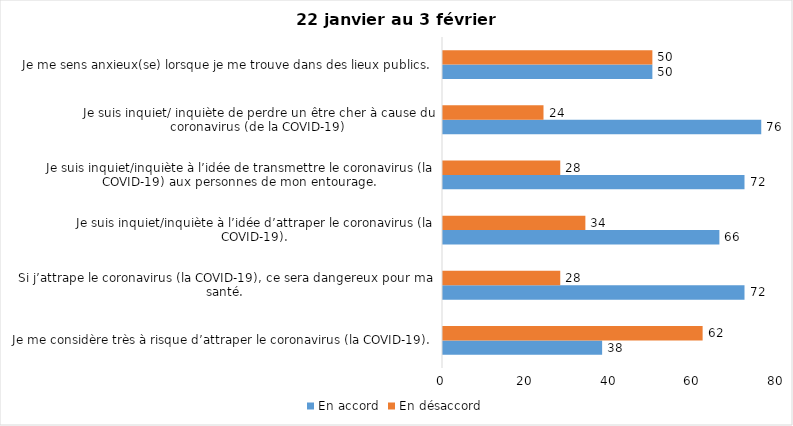
| Category | En accord | En désaccord |
|---|---|---|
| Je me considère très à risque d’attraper le coronavirus (la COVID-19). | 38 | 62 |
| Si j’attrape le coronavirus (la COVID-19), ce sera dangereux pour ma santé. | 72 | 28 |
| Je suis inquiet/inquiète à l’idée d’attraper le coronavirus (la COVID-19). | 66 | 34 |
| Je suis inquiet/inquiète à l’idée de transmettre le coronavirus (la COVID-19) aux personnes de mon entourage. | 72 | 28 |
| Je suis inquiet/ inquiète de perdre un être cher à cause du coronavirus (de la COVID-19) | 76 | 24 |
| Je me sens anxieux(se) lorsque je me trouve dans des lieux publics. | 50 | 50 |